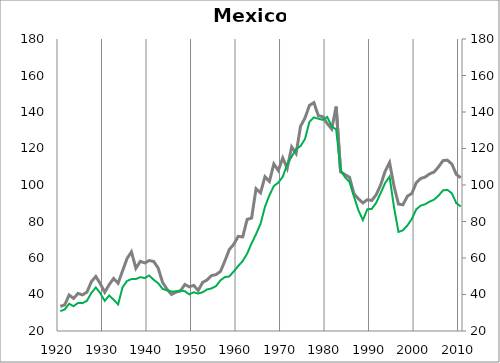
| Category | Mex17 |
|---|---|
| 1920.0 | 33.513 |
| 1921.0 | 34.277 |
| 1922.0 | 39.715 |
| 1923.0 | 37.858 |
| 1924.0 | 40.618 |
| 1925.0 | 39.778 |
| 1926.0 | 41.312 |
| 1927.0 | 47.018 |
| 1928.0 | 49.895 |
| 1929.0 | 45.925 |
| 1930.0 | 41.251 |
| 1931.0 | 45.42 |
| 1932.0 | 48.778 |
| 1933.0 | 46.168 |
| 1934.0 | 52.879 |
| 1935.0 | 59.669 |
| 1936.0 | 63.358 |
| 1937.0 | 54.359 |
| 1938.0 | 58.178 |
| 1939.0 | 57.299 |
| 1940.0 | 58.59 |
| 1941.0 | 58.127 |
| 1942.0 | 54.518 |
| 1943.0 | 46.648 |
| 1944.0 | 42.888 |
| 1945.0 | 39.999 |
| 1946.0 | 41.256 |
| 1947.0 | 41.91 |
| 1948.0 | 45.468 |
| 1949.0 | 44.224 |
| 1950.0 | 44.993 |
| 1951.0 | 42.189 |
| 1952.0 | 46.648 |
| 1953.0 | 47.966 |
| 1954.0 | 50.366 |
| 1955.0 | 50.899 |
| 1956.0 | 52.634 |
| 1957.0 | 58.409 |
| 1958.0 | 64.687 |
| 1959.0 | 67.549 |
| 1960.0 | 71.865 |
| 1961.0 | 71.565 |
| 1962.0 | 81.138 |
| 1963.0 | 81.898 |
| 1964.0 | 97.939 |
| 1965.0 | 95.724 |
| 1966.0 | 104.518 |
| 1967.0 | 101.979 |
| 1968.0 | 111.55 |
| 1969.0 | 107.97 |
| 1970.0 | 114.805 |
| 1971.0 | 109.158 |
| 1972.0 | 120.889 |
| 1973.0 | 117.283 |
| 1974.0 | 132.172 |
| 1975.0 | 136.761 |
| 1976.0 | 143.635 |
| 1977.0 | 145.13 |
| 1978.0 | 137.952 |
| 1979.0 | 137.433 |
| 1980.0 | 133.64 |
| 1981.0 | 130.716 |
| 1982.0 | 142.983 |
| 1983.0 | 107.199 |
| 1984.0 | 105.706 |
| 1985.0 | 104.209 |
| 1986.0 | 95.191 |
| 1987.0 | 92.425 |
| 1988.0 | 90.181 |
| 1989.0 | 91.918 |
| 1990.0 | 91.524 |
| 1991.0 | 94.683 |
| 1992.0 | 100.046 |
| 1993.0 | 107.522 |
| 1994.0 | 112.305 |
| 1995.0 | 99.355 |
| 1996.0 | 89.57 |
| 1997.0 | 89.149 |
| 1998.0 | 93.863 |
| 1999.0 | 95.361 |
| 2000.0 | 101.27 |
| 2001.0 | 103.578 |
| 2002.0 | 104.356 |
| 2003.0 | 106.106 |
| 2004.0 | 107.125 |
| 2005.0 | 109.922 |
| 2006.0 | 113.351 |
| 2007.0 | 113.607 |
| 2008.0 | 111.463 |
| 2009.0 | 105.816 |
| 2010.0 | 103.965 |